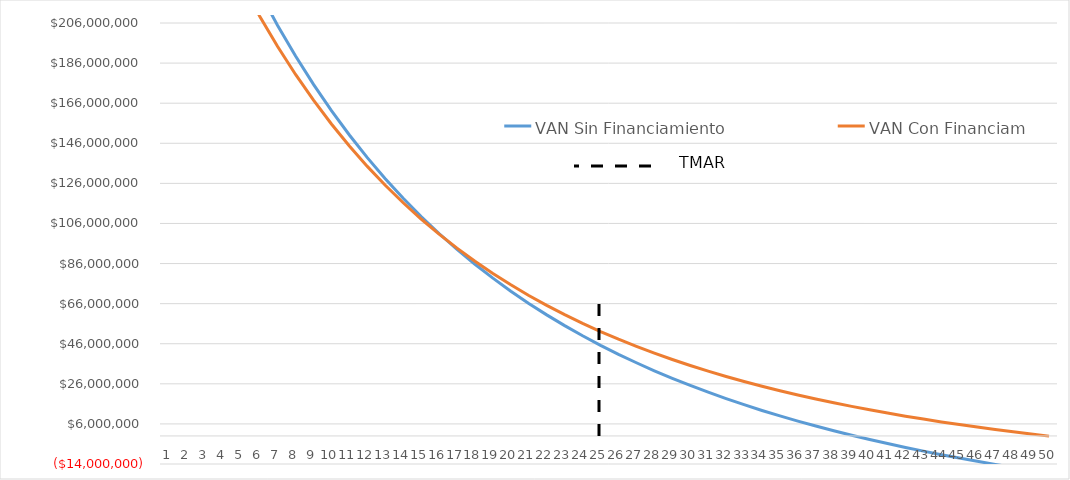
| Category | VAN Sin Financiamiento | VAN Con Financiamiento |
|---|---|---|
| 0 | 327596311.326 | 307727553.773 |
| 1 | 302637794.105 | 284513674.989 |
| 2 | 279714104.602 | 263255496.179 |
| 3 | 258631660.743 | 243763970.491 |
| 4 | 239217480.692 | 225870343.551 |
| 5 | 221316783.109 | 209423777.616 |
| 6 | 204790889.353 | 194289275.586 |
| 7 | 189515386.964 | 180345864.425 |
| 8 | 175378519.593 | 167485003.334 |
| 9 | 162279773.486 | 155609186.931 |
| 10 | 150128634.814 | 144630717.884 |
| 11 | 138843495.728 | 134470627.004 |
| 12 | 128350690.049 | 125057721.821 |
| 13 | 118583642.134 | 116327747.282 |
| 14 | 109482114.652 | 108222644.421 |
| 15 | 100991542.95 | 100689894.731 |
| 16 | 93062445.305 | 93681939.646 |
| 17 | 85649899.762 | 87155665.881 |
| 18 | 78713079.493 | 81071948.628 |
| 19 | 72214839.64 | 75395245.64 |
| 20 | 66121349.496 | 70093236.099 |
| 21 | 60401764.696 | 65136498.981 |
| 22 | 55027934.708 | 60498226.272 |
| 23 | 49974141.557 | 56153966.978 |
| 24 | 45216866.176 | 52081398.38 |
| 25 | 40734579.239 | 48260121.41 |
| 26 | 36507553.717 | 44671477.426 |
| 27 | 32517696.72 | 41298383.959 |
| 28 | 28748398.486 | 38125187.341 |
| 29 | 25184396.632 | 35137530.33 |
| 30 | 21811653.995 | 32322233.094 |
| 31 | 18617248.609 | 29667186.104 |
| 32 | 15589274.496 | 27161253.651 |
| 33 | 12716752.137 | 24794186.851 |
| 34 | 9989547.598 | 22556545.129 |
| 35 | 7398299.397 | 20439625.296 |
| 36 | 4934352.329 | 18435397.424 |
| 37 | 2589697.512 | 16536446.817 |
| 38 | 356918.032 | 14735921.447 |
| 39 | -1770860.382 | 13027484.309 |
| 40 | -3800014.153 | 11405270.192 |
| 41 | -5736462.588 | 9863846.415 |
| 42 | -7585704.921 | 8398177.158 |
| 43 | -9352854.061 | 7003591.005 |
| 44 | -11042667.33 | 5675751.406 |
| 45 | -12659574.515 | 4410629.763 |
| 46 | -14207703.462 | 3204480.892 |
| 47 | -15690903.462 | 2053820.635 |
| 48 | -17112766.637 | 955405.415 |
| 49 | -18476647.496 | -93786.453 |